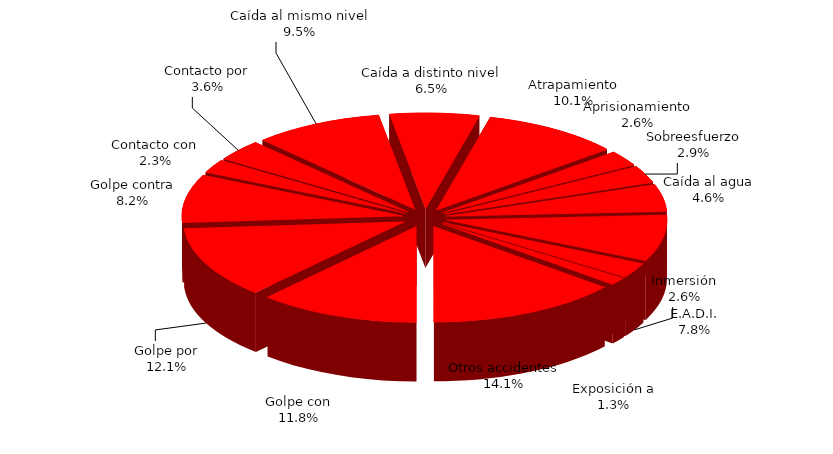
| Category | Series 0 |
|---|---|
| Golpe con | 36 |
| Golpe por | 37 |
| Golpe contra | 25 |
| Contacto con | 7 |
| Contacto por | 11 |
| Caída al mismo nivel | 29 |
| Caída a distinto nivel | 20 |
| Atrapamiento | 31 |
| Aprisionamiento | 8 |
| Sobreesfuerzo | 9 |
| Caída al agua | 14 |
| E.A.D.I. | 24 |
| Inmersión | 8 |
| Exposición a | 4 |
| Otros accidentes | 43 |